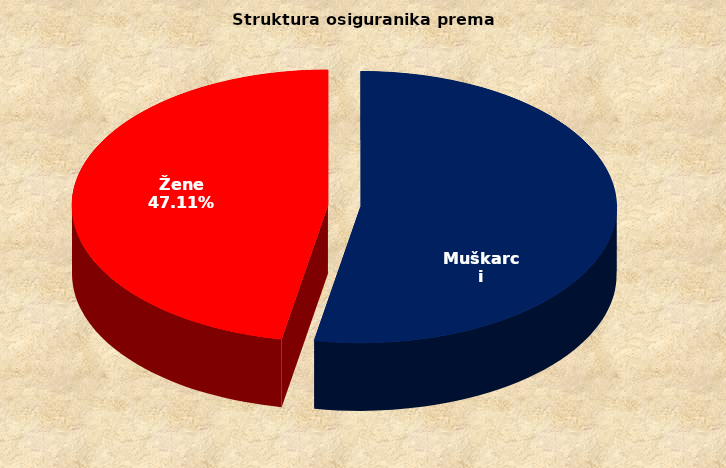
| Category | Series 0 |
|---|---|
| Muškarci | 857294 |
| Žene | 763497 |